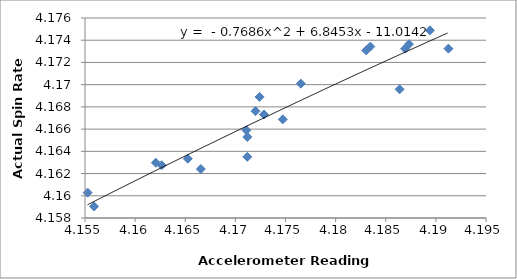
| Category | Series 0 |
|---|---|
| 4.155261852128517 | 4.16 |
| 4.1558997347480116 | 4.159 |
| 4.162064180626397 | 4.163 |
| 4.162649045911071 | 4.163 |
| 4.165251416159859 | 4.163 |
| 4.166552060353887 | 4.162 |
| 4.17109933333331 | 4.166 |
| 4.171191310316205 | 4.164 |
| 4.171194479465098 | 4.165 |
| 4.172010827517416 | 4.168 |
| 4.172414144144129 | 4.169 |
| 4.172854779270611 | 4.167 |
| 4.174731325628991 | 4.167 |
| 4.176528043478205 | 4.17 |
| 4.183049850327356 | 4.173 |
| 4.183463635640371 | 4.173 |
| 4.18638259361994 | 4.17 |
| 4.186925909090851 | 4.173 |
| 4.187315065856071 | 4.174 |
| 4.189402246093753 | 4.175 |
| 4.191251088362058 | 4.173 |